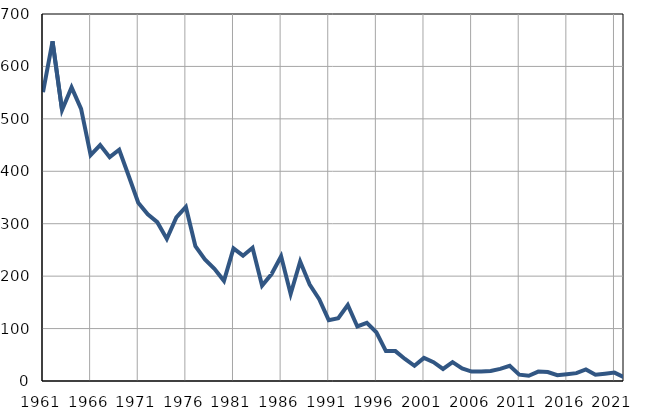
| Category | Infants
deaths |
|---|---|
| 1961.0 | 551 |
| 1962.0 | 648 |
| 1963.0 | 517 |
| 1964.0 | 560 |
| 1965.0 | 519 |
| 1966.0 | 431 |
| 1967.0 | 450 |
| 1968.0 | 427 |
| 1969.0 | 441 |
| 1970.0 | 391 |
| 1971.0 | 340 |
| 1972.0 | 318 |
| 1973.0 | 303 |
| 1974.0 | 271 |
| 1975.0 | 312 |
| 1976.0 | 332 |
| 1977.0 | 257 |
| 1978.0 | 232 |
| 1979.0 | 214 |
| 1980.0 | 191 |
| 1981.0 | 253 |
| 1982.0 | 239 |
| 1983.0 | 254 |
| 1984.0 | 182 |
| 1985.0 | 204 |
| 1986.0 | 238 |
| 1987.0 | 166 |
| 1988.0 | 228 |
| 1989.0 | 184 |
| 1990.0 | 156 |
| 1991.0 | 116 |
| 1992.0 | 120 |
| 1993.0 | 145 |
| 1994.0 | 104 |
| 1995.0 | 111 |
| 1996.0 | 93 |
| 1997.0 | 57 |
| 1998.0 | 57 |
| 1999.0 | 42 |
| 2000.0 | 29 |
| 2001.0 | 44 |
| 2002.0 | 36 |
| 2003.0 | 23 |
| 2004.0 | 36 |
| 2005.0 | 24 |
| 2006.0 | 18 |
| 2007.0 | 18 |
| 2008.0 | 19 |
| 2009.0 | 23 |
| 2010.0 | 29 |
| 2011.0 | 12 |
| 2012.0 | 10 |
| 2013.0 | 18 |
| 2014.0 | 17 |
| 2015.0 | 11 |
| 2016.0 | 13 |
| 2017.0 | 15 |
| 2018.0 | 22 |
| 2019.0 | 12 |
| 2020.0 | 14 |
| 2021.0 | 16 |
| 2022.0 | 7 |